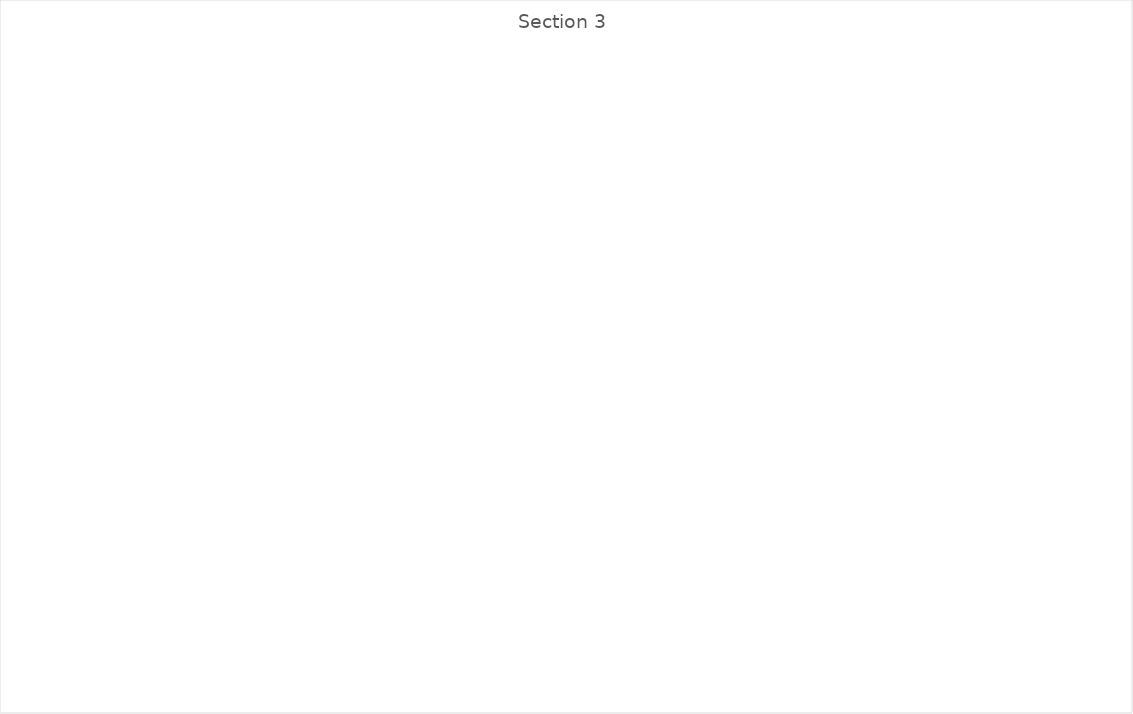
| Category | Series 1 |
|---|---|
| Clear purpose | 0 |
| An agreed way of working that reflects values | 0 |
| Staff know what is important to each other and how to support each other | 0 |
| Staff know what is expected of them | 0 |
| Staff feel their opinions matter | 0 |
| Rosters - staff are thoughtfully matched to people and rosters are personalised to people who are supported | 0 |
| Recruitment and selection | 0 |
| Enabling risk | 0 |
| Training and  professional development | 0 |
| Supervision | 0 |
| Performance planning, support and development | 0 |
| Meetings | 0 |